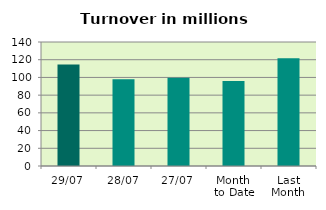
| Category | Series 0 |
|---|---|
| 29/07 | 114.497 |
| 28/07 | 97.9 |
| 27/07 | 99.739 |
| Month 
to Date | 95.926 |
| Last
Month | 121.74 |